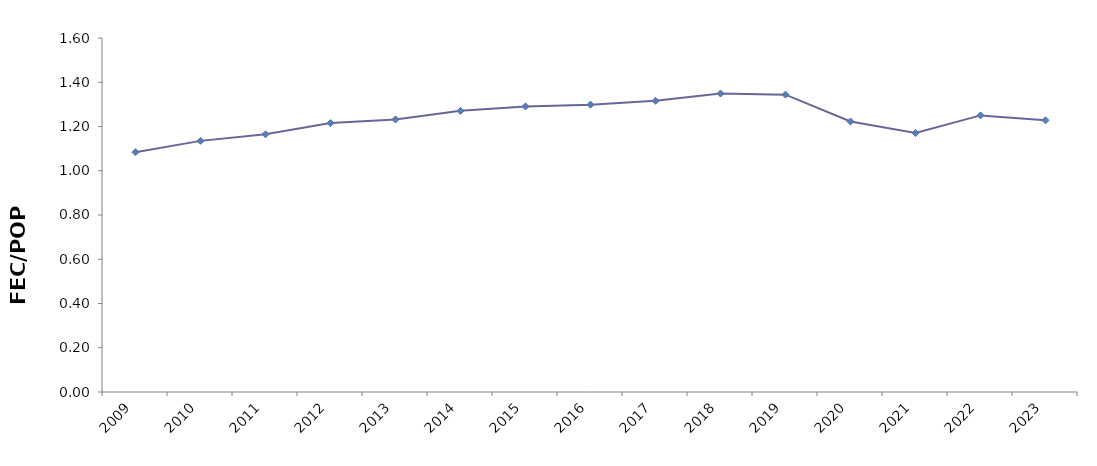
| Category | FEC per Capita (toe/Person) |
|---|---|
| 2009 | 1.084 |
| 2010 | 1.135 |
| 2011 | 1.165 |
| 2012 | 1.215 |
| 2013 | 1.232 |
| 2014 | 1.271 |
| 2015 | 1.291 |
| 2016 | 1.299 |
| 2017 | 1.316 |
| 2018 | 1.349 |
| 2019 | 1.344 |
| 2020 | 1.223 |
| 2021 | 1.17 |
| 2022 | 1.25 |
| 2023 | 1.228 |